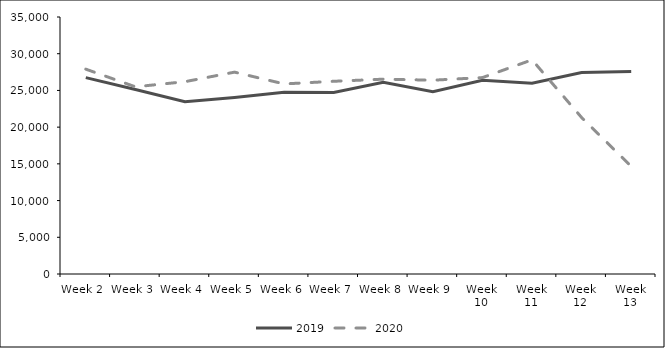
| Category | 2019 | 2020 |
|---|---|---|
| 0 | 26745 | 27898 |
| 1 | 25135 | 25493 |
| 2 | 23456 | 26192 |
| 3 | 24039 | 27490 |
| 4 | 24761 | 25884 |
| 5 | 24726 | 26244 |
| 6 | 26098 | 26533 |
| 7 | 24811 | 26393 |
| 8 | 26370 | 26750 |
| 9 | 25971 | 29166 |
| 10 | 27436 | 21308 |
| 11 | 27572 | 14659 |